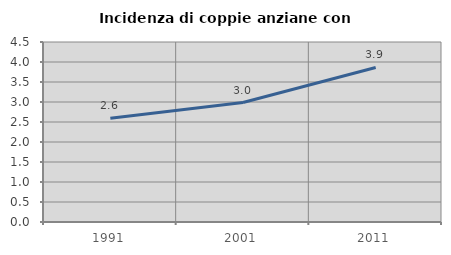
| Category | Incidenza di coppie anziane con figli |
|---|---|
| 1991.0 | 2.591 |
| 2001.0 | 2.986 |
| 2011.0 | 3.864 |